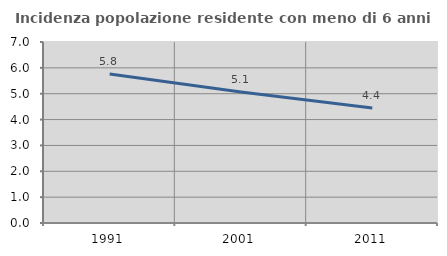
| Category | Incidenza popolazione residente con meno di 6 anni |
|---|---|
| 1991.0 | 5.766 |
| 2001.0 | 5.067 |
| 2011.0 | 4.444 |